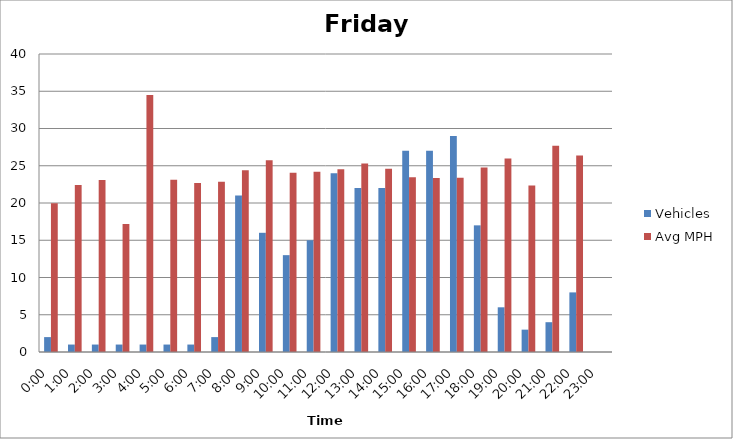
| Category | Vehicles | Avg MPH |
|---|---|---|
| 0:00 | 2 | 19.97 |
| 1:00 | 1 | 22.43 |
| 2:00 | 1 | 23.09 |
| 3:00 | 1 | 17.18 |
| 4:00 | 1 | 34.51 |
| 5:00 | 1 | 23.12 |
| 6:00 | 1 | 22.69 |
| 7:00 | 2 | 22.86 |
| 8:00 | 21 | 24.39 |
| 9:00 | 16 | 25.73 |
| 10:00 | 13 | 24.05 |
| 11:00 | 15 | 24.19 |
| 12:00 | 24 | 24.53 |
| 13:00 | 22 | 25.3 |
| 14:00 | 22 | 24.6 |
| 15:00 | 27 | 23.46 |
| 16:00 | 27 | 23.34 |
| 17:00 | 29 | 23.38 |
| 18:00 | 17 | 24.76 |
| 19:00 | 6 | 25.96 |
| 20:00 | 3 | 22.36 |
| 21:00 | 4 | 27.7 |
| 22:00 | 8 | 26.37 |
| 23:00 | 0 | 0 |